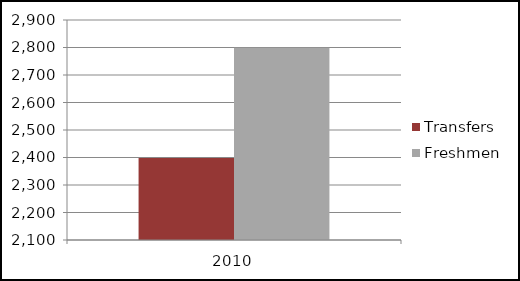
| Category | Transfers | Freshmen |
|---|---|---|
| 2010.0 | 2398 | 2799 |